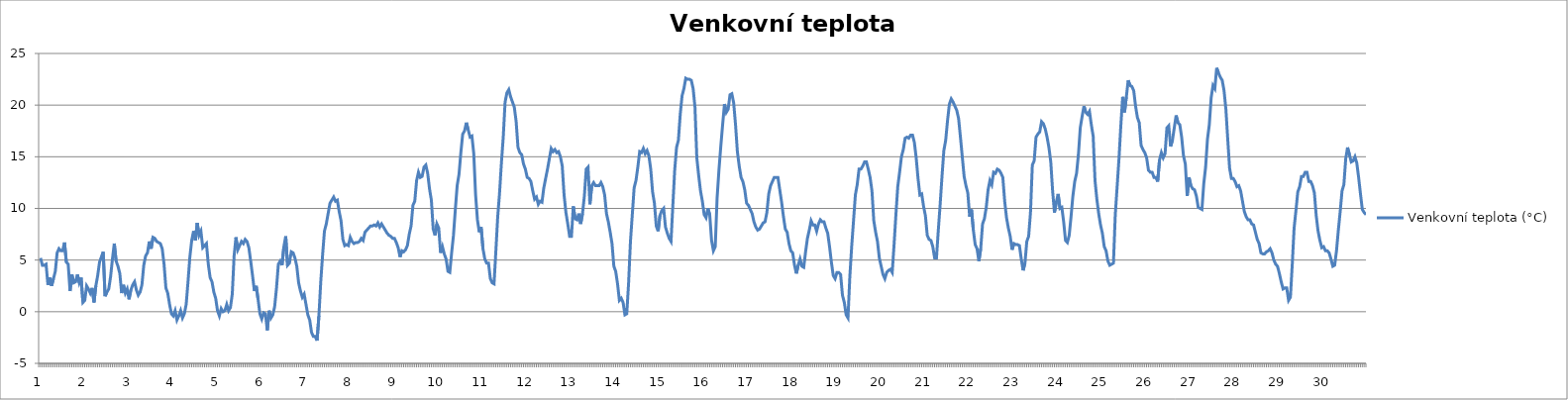
| Category | Venkovní teplota (°C) |
|---|---|
| 0 | 5.2 |
| 1 | 4.5 |
| 2 | 4.5 |
| 3 | 4.6 |
| 4 | 2.6 |
| 5 | 3.3 |
| 6 | 2.5 |
| 7 | 3.2 |
| 8 | 3.9 |
| 9 | 5.7 |
| 10 | 6.1 |
| 11 | 5.9 |
| 12 | 5.9 |
| 13 | 6.7 |
| 14 | 4.8 |
| 15 | 4.6 |
| 16 | 2 |
| 17 | 3.6 |
| 18 | 2.8 |
| 19 | 2.9 |
| 20 | 3.6 |
| 21 | 2.8 |
| 22 | 3.3 |
| 23 | 0.9 |
| 24 | 1.1 |
| 25 | 2.5 |
| 26 | 2.2 |
| 27 | 1.8 |
| 28 | 2.3 |
| 29 | 0.9 |
| 30 | 2.5 |
| 31 | 3.5 |
| 32 | 4.8 |
| 33 | 5.3 |
| 34 | 5.8 |
| 35 | 1.5 |
| 36 | 1.9 |
| 37 | 2.2 |
| 38 | 3.4 |
| 39 | 5.1 |
| 40 | 6.6 |
| 41 | 4.9 |
| 42 | 4.4 |
| 43 | 3.7 |
| 44 | 1.8 |
| 45 | 2.6 |
| 46 | 1.8 |
| 47 | 2.2 |
| 48 | 1.2 |
| 49 | 2.1 |
| 50 | 2.6 |
| 51 | 2.9 |
| 52 | 2.1 |
| 53 | 1.6 |
| 54 | 1.9 |
| 55 | 2.6 |
| 56 | 4.5 |
| 57 | 5.4 |
| 58 | 5.7 |
| 59 | 6.8 |
| 60 | 6.1 |
| 61 | 7.2 |
| 62 | 7.1 |
| 63 | 6.8 |
| 64 | 6.7 |
| 65 | 6.6 |
| 66 | 6.1 |
| 67 | 4.6 |
| 68 | 2.3 |
| 69 | 1.8 |
| 70 | 0.7 |
| 71 | -0.2 |
| 72 | -0.4 |
| 73 | 0.1 |
| 74 | -0.8 |
| 75 | -0.4 |
| 76 | 0.1 |
| 77 | -0.6 |
| 78 | -0.2 |
| 79 | 0.7 |
| 80 | 2.9 |
| 81 | 5.3 |
| 82 | 6.9 |
| 83 | 7.8 |
| 84 | 6.9 |
| 85 | 8.6 |
| 86 | 7.4 |
| 87 | 7.8 |
| 88 | 6.2 |
| 89 | 6.4 |
| 90 | 6.6 |
| 91 | 4.6 |
| 92 | 3.3 |
| 93 | 2.9 |
| 94 | 1.9 |
| 95 | 1.3 |
| 96 | 0.1 |
| 97 | -0.4 |
| 98 | 0.3 |
| 99 | 0 |
| 100 | 0.1 |
| 101 | 0.7 |
| 102 | 0.1 |
| 103 | 0.4 |
| 104 | 1.7 |
| 105 | 5.4 |
| 106 | 7.2 |
| 107 | 6 |
| 108 | 6.4 |
| 109 | 6.8 |
| 110 | 6.6 |
| 111 | 7 |
| 112 | 6.8 |
| 113 | 6.2 |
| 114 | 4.9 |
| 115 | 3.5 |
| 116 | 2 |
| 117 | 2.5 |
| 118 | 1.2 |
| 119 | -0.2 |
| 120 | -0.7 |
| 121 | -0.1 |
| 122 | -0.2 |
| 123 | -1.8 |
| 124 | 0.1 |
| 125 | -0.6 |
| 126 | -0.3 |
| 127 | 0.5 |
| 128 | 2.3 |
| 129 | 4.6 |
| 130 | 4.9 |
| 131 | 4.5 |
| 132 | 6.3 |
| 133 | 7.3 |
| 134 | 4.5 |
| 135 | 4.7 |
| 136 | 5.8 |
| 137 | 5.7 |
| 138 | 5.2 |
| 139 | 4.4 |
| 140 | 2.8 |
| 141 | 2 |
| 142 | 1.4 |
| 143 | 1.7 |
| 144 | 0.7 |
| 145 | -0.3 |
| 146 | -0.8 |
| 147 | -2 |
| 148 | -2.4 |
| 149 | -2.4 |
| 150 | -2.8 |
| 151 | -0.4 |
| 152 | 2.9 |
| 153 | 5.5 |
| 154 | 7.8 |
| 155 | 8.5 |
| 156 | 9.5 |
| 157 | 10.5 |
| 158 | 10.8 |
| 159 | 11.1 |
| 160 | 10.7 |
| 161 | 10.8 |
| 162 | 9.7 |
| 163 | 8.8 |
| 164 | 7 |
| 165 | 6.4 |
| 166 | 6.5 |
| 167 | 6.4 |
| 168 | 7.2 |
| 169 | 6.8 |
| 170 | 6.6 |
| 171 | 6.7 |
| 172 | 6.7 |
| 173 | 6.8 |
| 174 | 7.1 |
| 175 | 6.9 |
| 176 | 7.7 |
| 177 | 7.9 |
| 178 | 8.1 |
| 179 | 8.3 |
| 180 | 8.3 |
| 181 | 8.4 |
| 182 | 8.3 |
| 183 | 8.6 |
| 184 | 8.2 |
| 185 | 8.5 |
| 186 | 8.2 |
| 187 | 7.9 |
| 188 | 7.6 |
| 189 | 7.4 |
| 190 | 7.3 |
| 191 | 7.1 |
| 192 | 7.1 |
| 193 | 6.7 |
| 194 | 6.2 |
| 195 | 5.3 |
| 196 | 5.9 |
| 197 | 5.8 |
| 198 | 6 |
| 199 | 6.4 |
| 200 | 7.5 |
| 201 | 8.3 |
| 202 | 10.3 |
| 203 | 10.7 |
| 204 | 12.7 |
| 205 | 13.5 |
| 206 | 13 |
| 207 | 13.1 |
| 208 | 14 |
| 209 | 14.2 |
| 210 | 13.4 |
| 211 | 11.9 |
| 212 | 10.8 |
| 213 | 8 |
| 214 | 7.4 |
| 215 | 8.5 |
| 216 | 8.1 |
| 217 | 5.7 |
| 218 | 6.3 |
| 219 | 5.6 |
| 220 | 5.1 |
| 221 | 3.9 |
| 222 | 3.8 |
| 223 | 5.7 |
| 224 | 7.4 |
| 225 | 9.9 |
| 226 | 12.2 |
| 227 | 13.3 |
| 228 | 15.4 |
| 229 | 17.2 |
| 230 | 17.5 |
| 231 | 18.3 |
| 232 | 17.6 |
| 233 | 16.9 |
| 234 | 17 |
| 235 | 15.3 |
| 236 | 11.3 |
| 237 | 8.9 |
| 238 | 7.7 |
| 239 | 8.2 |
| 240 | 6.1 |
| 241 | 5.1 |
| 242 | 4.7 |
| 243 | 4.7 |
| 244 | 3.2 |
| 245 | 2.8 |
| 246 | 2.7 |
| 247 | 5.9 |
| 248 | 9.2 |
| 249 | 11.5 |
| 250 | 14.4 |
| 251 | 16.9 |
| 252 | 20.3 |
| 253 | 21.2 |
| 254 | 21.5 |
| 255 | 20.8 |
| 256 | 20.3 |
| 257 | 19.8 |
| 258 | 18.4 |
| 259 | 15.9 |
| 260 | 15.4 |
| 261 | 15.2 |
| 262 | 14.3 |
| 263 | 13.8 |
| 264 | 13 |
| 265 | 12.9 |
| 266 | 12.6 |
| 267 | 11.7 |
| 268 | 10.9 |
| 269 | 11.1 |
| 270 | 10.4 |
| 271 | 10.7 |
| 272 | 10.6 |
| 273 | 12 |
| 274 | 12.9 |
| 275 | 13.8 |
| 276 | 14.8 |
| 277 | 15.8 |
| 278 | 15.5 |
| 279 | 15.7 |
| 280 | 15.4 |
| 281 | 15.5 |
| 282 | 15 |
| 283 | 14.1 |
| 284 | 11.3 |
| 285 | 9.6 |
| 286 | 8.5 |
| 287 | 7.3 |
| 288 | 7.3 |
| 289 | 10.2 |
| 290 | 9 |
| 291 | 8.9 |
| 292 | 9.5 |
| 293 | 8.5 |
| 294 | 9.5 |
| 295 | 11.2 |
| 296 | 13.8 |
| 297 | 14 |
| 298 | 10.4 |
| 299 | 12.2 |
| 300 | 12.5 |
| 301 | 12.2 |
| 302 | 12.2 |
| 303 | 12.2 |
| 304 | 12.5 |
| 305 | 12.1 |
| 306 | 11.3 |
| 307 | 9.5 |
| 308 | 8.7 |
| 309 | 7.7 |
| 310 | 6.6 |
| 311 | 4.4 |
| 312 | 3.9 |
| 313 | 2.7 |
| 314 | 1.1 |
| 315 | 1.3 |
| 316 | 0.9 |
| 317 | -0.3 |
| 318 | -0.2 |
| 319 | 2.8 |
| 320 | 6.8 |
| 321 | 9.4 |
| 322 | 12 |
| 323 | 12.7 |
| 324 | 14 |
| 325 | 15.5 |
| 326 | 15.4 |
| 327 | 15.8 |
| 328 | 15.3 |
| 329 | 15.6 |
| 330 | 15.1 |
| 331 | 13.8 |
| 332 | 11.6 |
| 333 | 10.5 |
| 334 | 8.3 |
| 335 | 7.8 |
| 336 | 9.3 |
| 337 | 9.8 |
| 338 | 10 |
| 339 | 8.2 |
| 340 | 7.6 |
| 341 | 7.1 |
| 342 | 6.8 |
| 343 | 10.3 |
| 344 | 13.7 |
| 345 | 15.9 |
| 346 | 16.6 |
| 347 | 19.1 |
| 348 | 20.9 |
| 349 | 21.6 |
| 350 | 22.6 |
| 351 | 22.5 |
| 352 | 22.5 |
| 353 | 22.4 |
| 354 | 21.6 |
| 355 | 19.8 |
| 356 | 14.9 |
| 357 | 13.2 |
| 358 | 11.7 |
| 359 | 10.7 |
| 360 | 9.4 |
| 361 | 9.1 |
| 362 | 10 |
| 363 | 9.4 |
| 364 | 6.9 |
| 365 | 5.9 |
| 366 | 6.3 |
| 367 | 11 |
| 368 | 13.7 |
| 369 | 16 |
| 370 | 18.1 |
| 371 | 20.1 |
| 372 | 19.3 |
| 373 | 19.6 |
| 374 | 21 |
| 375 | 21.1 |
| 376 | 20.2 |
| 377 | 18.1 |
| 378 | 15.5 |
| 379 | 14.1 |
| 380 | 13 |
| 381 | 12.6 |
| 382 | 11.8 |
| 383 | 10.5 |
| 384 | 10.3 |
| 385 | 9.9 |
| 386 | 9.5 |
| 387 | 8.7 |
| 388 | 8.2 |
| 389 | 7.9 |
| 390 | 8 |
| 391 | 8.3 |
| 392 | 8.6 |
| 393 | 8.7 |
| 394 | 9.6 |
| 395 | 11.4 |
| 396 | 12.2 |
| 397 | 12.6 |
| 398 | 13 |
| 399 | 13 |
| 400 | 13 |
| 401 | 11.8 |
| 402 | 10.6 |
| 403 | 9.2 |
| 404 | 8 |
| 405 | 7.7 |
| 406 | 6.6 |
| 407 | 5.9 |
| 408 | 5.7 |
| 409 | 4.5 |
| 410 | 3.7 |
| 411 | 4.5 |
| 412 | 5.1 |
| 413 | 4.4 |
| 414 | 4.3 |
| 415 | 5.8 |
| 416 | 7.1 |
| 417 | 7.9 |
| 418 | 8.8 |
| 419 | 8.4 |
| 420 | 8.4 |
| 421 | 7.8 |
| 422 | 8.5 |
| 423 | 8.9 |
| 424 | 8.7 |
| 425 | 8.7 |
| 426 | 8.1 |
| 427 | 7.6 |
| 428 | 6.3 |
| 429 | 4.8 |
| 430 | 3.5 |
| 431 | 3.2 |
| 432 | 3.8 |
| 433 | 3.8 |
| 434 | 3.6 |
| 435 | 1.6 |
| 436 | 0.9 |
| 437 | -0.3 |
| 438 | -0.6 |
| 439 | 3.4 |
| 440 | 6.3 |
| 441 | 8.8 |
| 442 | 11.3 |
| 443 | 12.3 |
| 444 | 13.8 |
| 445 | 13.8 |
| 446 | 14.1 |
| 447 | 14.5 |
| 448 | 14.5 |
| 449 | 13.8 |
| 450 | 13 |
| 451 | 11.7 |
| 452 | 8.8 |
| 453 | 7.7 |
| 454 | 6.8 |
| 455 | 5.2 |
| 456 | 4.4 |
| 457 | 3.6 |
| 458 | 3.2 |
| 459 | 3.8 |
| 460 | 4 |
| 461 | 4.1 |
| 462 | 3.8 |
| 463 | 6.5 |
| 464 | 9.4 |
| 465 | 12.1 |
| 466 | 13.5 |
| 467 | 15 |
| 468 | 15.7 |
| 469 | 16.8 |
| 470 | 16.9 |
| 471 | 16.8 |
| 472 | 17.1 |
| 473 | 17.1 |
| 474 | 16.4 |
| 475 | 14.9 |
| 476 | 12.9 |
| 477 | 11.3 |
| 478 | 11.4 |
| 479 | 10.2 |
| 480 | 9.3 |
| 481 | 7.4 |
| 482 | 7 |
| 483 | 6.9 |
| 484 | 6.3 |
| 485 | 5.2 |
| 486 | 5.2 |
| 487 | 7.9 |
| 488 | 10.4 |
| 489 | 13.1 |
| 490 | 15.6 |
| 491 | 16.6 |
| 492 | 18.5 |
| 493 | 20.1 |
| 494 | 20.6 |
| 495 | 20.3 |
| 496 | 19.9 |
| 497 | 19.5 |
| 498 | 18.7 |
| 499 | 16.9 |
| 500 | 15 |
| 501 | 13.1 |
| 502 | 12.2 |
| 503 | 11.5 |
| 504 | 9.2 |
| 505 | 9.9 |
| 506 | 7.9 |
| 507 | 6.5 |
| 508 | 6.1 |
| 509 | 4.9 |
| 510 | 6.1 |
| 511 | 8.5 |
| 512 | 9 |
| 513 | 10.1 |
| 514 | 11.8 |
| 515 | 12.7 |
| 516 | 12.3 |
| 517 | 13.5 |
| 518 | 13.4 |
| 519 | 13.8 |
| 520 | 13.7 |
| 521 | 13.4 |
| 522 | 13 |
| 523 | 10.7 |
| 524 | 9.1 |
| 525 | 8.1 |
| 526 | 7.3 |
| 527 | 6 |
| 528 | 6.6 |
| 529 | 6.5 |
| 530 | 6.5 |
| 531 | 6.4 |
| 532 | 5.1 |
| 533 | 4 |
| 534 | 4.7 |
| 535 | 6.8 |
| 536 | 7.3 |
| 537 | 9.6 |
| 538 | 14.2 |
| 539 | 14.6 |
| 540 | 16.9 |
| 541 | 17.2 |
| 542 | 17.4 |
| 543 | 18.4 |
| 544 | 18.2 |
| 545 | 17.7 |
| 546 | 16.9 |
| 547 | 15.9 |
| 548 | 14.5 |
| 549 | 11.7 |
| 550 | 9.6 |
| 551 | 10.6 |
| 552 | 11.4 |
| 553 | 10 |
| 554 | 10.1 |
| 555 | 8.7 |
| 556 | 6.9 |
| 557 | 6.7 |
| 558 | 7.4 |
| 559 | 9.2 |
| 560 | 11.2 |
| 561 | 12.6 |
| 562 | 13.4 |
| 563 | 15.2 |
| 564 | 17.8 |
| 565 | 18.9 |
| 566 | 19.9 |
| 567 | 19.3 |
| 568 | 19.1 |
| 569 | 19.4 |
| 570 | 18.1 |
| 571 | 17 |
| 572 | 12.7 |
| 573 | 10.9 |
| 574 | 9.5 |
| 575 | 8.4 |
| 576 | 7.6 |
| 577 | 6.3 |
| 578 | 5.9 |
| 579 | 4.9 |
| 580 | 4.5 |
| 581 | 4.6 |
| 582 | 4.7 |
| 583 | 9.4 |
| 584 | 12.1 |
| 585 | 14.8 |
| 586 | 18 |
| 587 | 20.8 |
| 588 | 19.3 |
| 589 | 20.8 |
| 590 | 22.4 |
| 591 | 21.9 |
| 592 | 21.8 |
| 593 | 21.4 |
| 594 | 19.9 |
| 595 | 18.8 |
| 596 | 18.3 |
| 597 | 16.1 |
| 598 | 15.7 |
| 599 | 15.4 |
| 600 | 14.9 |
| 601 | 13.7 |
| 602 | 13.5 |
| 603 | 13.5 |
| 604 | 13 |
| 605 | 13 |
| 606 | 12.6 |
| 607 | 14.7 |
| 608 | 15.4 |
| 609 | 14.9 |
| 610 | 15.3 |
| 611 | 17.8 |
| 612 | 18 |
| 613 | 16 |
| 614 | 16.6 |
| 615 | 17.8 |
| 616 | 19 |
| 617 | 18.3 |
| 618 | 18.1 |
| 619 | 16.9 |
| 620 | 15.1 |
| 621 | 14.3 |
| 622 | 11.2 |
| 623 | 13 |
| 624 | 12.2 |
| 625 | 11.9 |
| 626 | 11.8 |
| 627 | 11.2 |
| 628 | 10.1 |
| 629 | 10 |
| 630 | 9.9 |
| 631 | 12.4 |
| 632 | 14 |
| 633 | 16.7 |
| 634 | 18.1 |
| 635 | 20.7 |
| 636 | 21.9 |
| 637 | 21.6 |
| 638 | 23.6 |
| 639 | 23.1 |
| 640 | 22.7 |
| 641 | 22.4 |
| 642 | 21.4 |
| 643 | 19.6 |
| 644 | 16.7 |
| 645 | 13.9 |
| 646 | 12.9 |
| 647 | 12.9 |
| 648 | 12.6 |
| 649 | 12.1 |
| 650 | 12.2 |
| 651 | 11.7 |
| 652 | 10.7 |
| 653 | 9.7 |
| 654 | 9.2 |
| 655 | 8.9 |
| 656 | 8.9 |
| 657 | 8.5 |
| 658 | 8.4 |
| 659 | 7.7 |
| 660 | 7 |
| 661 | 6.6 |
| 662 | 5.7 |
| 663 | 5.6 |
| 664 | 5.6 |
| 665 | 5.8 |
| 666 | 5.9 |
| 667 | 6.1 |
| 668 | 5.7 |
| 669 | 5 |
| 670 | 4.6 |
| 671 | 4.4 |
| 672 | 3.7 |
| 673 | 2.9 |
| 674 | 2.2 |
| 675 | 2.3 |
| 676 | 2.3 |
| 677 | 1.1 |
| 678 | 1.4 |
| 679 | 4.6 |
| 680 | 8.1 |
| 681 | 9.8 |
| 682 | 11.6 |
| 683 | 12.1 |
| 684 | 13.1 |
| 685 | 13.1 |
| 686 | 13.5 |
| 687 | 13.5 |
| 688 | 12.6 |
| 689 | 12.6 |
| 690 | 12.2 |
| 691 | 11.5 |
| 692 | 9.3 |
| 693 | 7.8 |
| 694 | 6.9 |
| 695 | 6.2 |
| 696 | 6.3 |
| 697 | 5.9 |
| 698 | 5.9 |
| 699 | 5.7 |
| 700 | 5.1 |
| 701 | 4.4 |
| 702 | 4.5 |
| 703 | 5.9 |
| 704 | 7.9 |
| 705 | 9.7 |
| 706 | 11.7 |
| 707 | 12.3 |
| 708 | 14.8 |
| 709 | 15.9 |
| 710 | 15.2 |
| 711 | 14.5 |
| 712 | 14.6 |
| 713 | 15 |
| 714 | 14.4 |
| 715 | 13 |
| 716 | 11.4 |
| 717 | 9.9 |
| 718 | 9.6 |
| 719 | 9.4 |